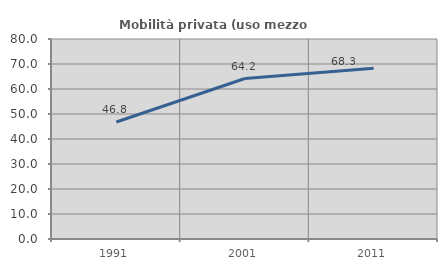
| Category | Mobilità privata (uso mezzo privato) |
|---|---|
| 1991.0 | 46.782 |
| 2001.0 | 64.194 |
| 2011.0 | 68.293 |